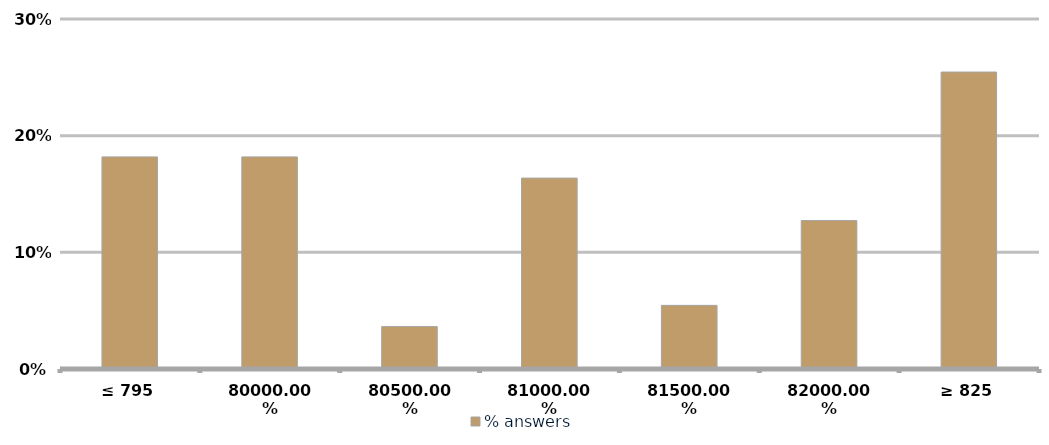
| Category | % answers |
|---|---|
| ≤ 795 | 0.182 |
| 800 | 0.182 |
| 805 | 0.036 |
| 810 | 0.164 |
| 815 | 0.055 |
| 820 | 0.127 |
| ≥ 825 | 0.255 |